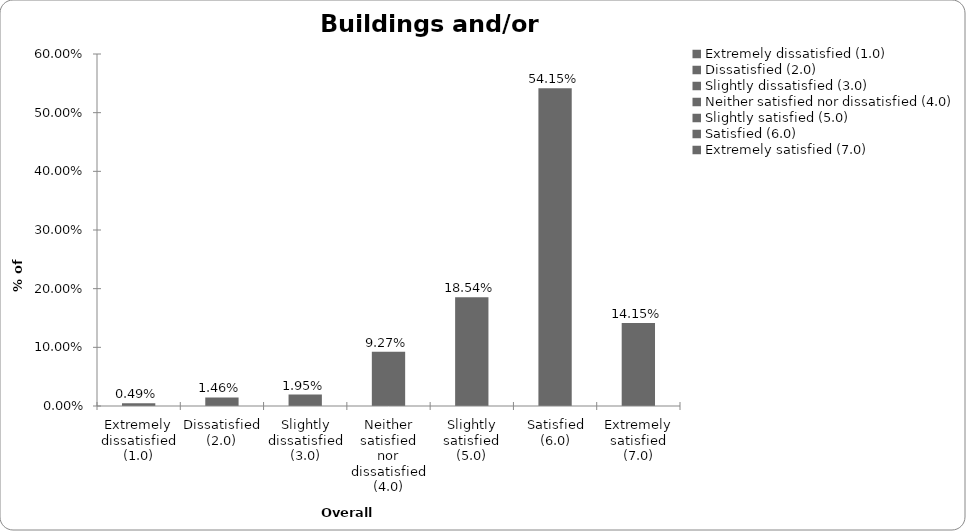
| Category | Series 0 |
|---|---|
| Extremely dissatisfied (1.0) | 0.005 |
| Dissatisfied (2.0) | 0.015 |
| Slightly dissatisfied (3.0) | 0.02 |
| Neither satisfied nor dissatisfied (4.0) | 0.093 |
| Slightly satisfied (5.0) | 0.185 |
| Satisfied (6.0) | 0.541 |
| Extremely satisfied (7.0) | 0.141 |